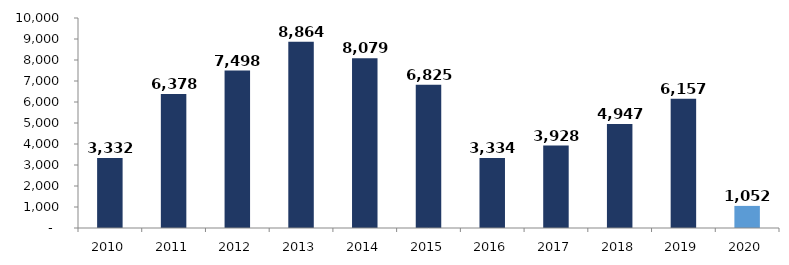
| Category | Series 0 |
|---|---|
| 2010.0 | 3331.554 |
| 2011.0 | 6377.615 |
| 2012.0 | 7498.207 |
| 2013.0 | 8863.622 |
| 2014.0 | 8079.21 |
| 2015.0 | 6824.624 |
| 2016.0 | 3333.564 |
| 2017.0 | 3928.017 |
| 2018.0 | 4947.435 |
| 2019.0 | 6157.132 |
| 2020.0 | 1052.152 |